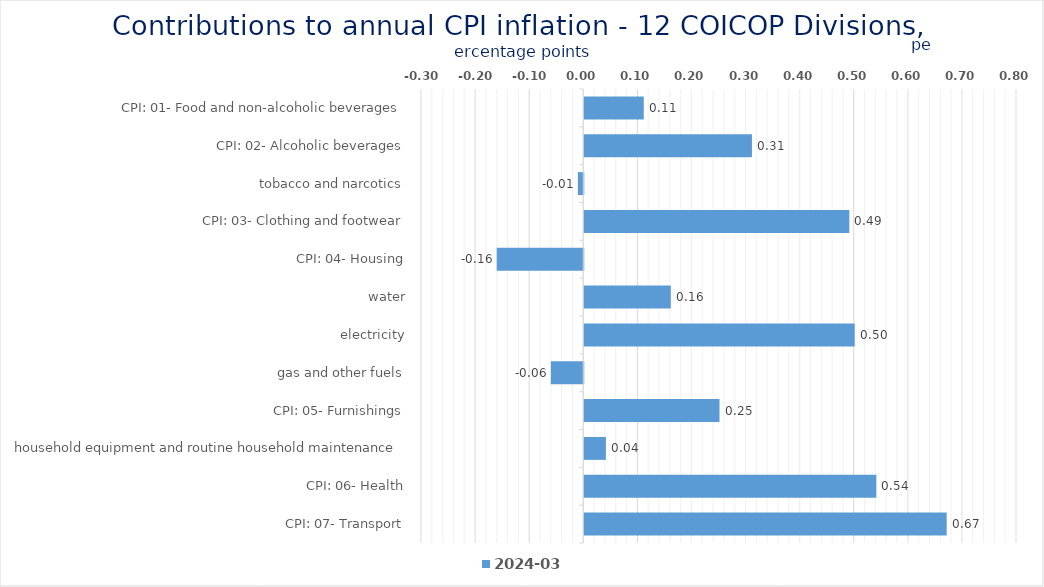
| Category | 2024-03 |
|---|---|
| CPI: 01- Food and non-alcoholic beverages | 0.11 |
| CPI: 02- Alcoholic beverages, tobacco and narcotics | 0.31 |
| CPI: 03- Clothing and footwear | -0.01 |
| CPI: 04- Housing, water, electricity, gas and other fuels | 0.49 |
| CPI: 05- Furnishings, household equipment and routine household maintenance | -0.16 |
| CPI: 06- Health | 0.16 |
| CPI: 07- Transport | 0.5 |
| CPI: 08- Communication | -0.06 |
| CPI: 09- Recreation and culture | 0.25 |
| CPI: 10- Education | 0.04 |
| CPI: 11- Restaurants and hotels | 0.54 |
| CPI: 12- Miscellaneous goods and services | 0.67 |